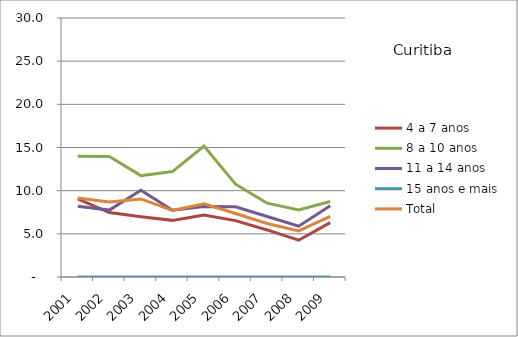
| Category | 4 a 7 anos | 8 a 10 anos | 11 a 14 anos | 15 anos e mais | Total |
|---|---|---|---|---|---|
| 2001.0 | 9.05 | 14 | 8.2 | 0 | 9.15 |
| 2002.0 | 7.46 | 13.95 | 7.75 | 0 | 8.7 |
| 2003.0 | 6.97 | 11.74 | 10.05 | 0 | 9.04 |
| 2004.0 | 6.56 | 12.21 | 7.73 | 0 | 7.72 |
| 2005.0 | 7.19 | 15.17 | 8.16 | 0 | 8.47 |
| 2006.0 | 6.53 | 10.75 | 8.13 | 0 | 7.35 |
| 2007.0 | 5.45 | 8.55 | 7.01 | 0 | 6.2 |
| 2008.0 | 4.26 | 7.76 | 5.89 | 0 | 5.33 |
| 2009.0 | 6.3 | 8.75 | 8.24 | 0 | 7.03 |